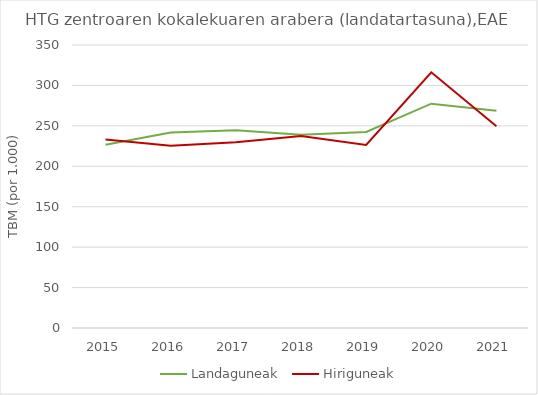
| Category | Landaguneak | Hiriguneak |
|---|---|---|
| 2015.0 | 226.665 | 233.213 |
| 2016.0 | 241.832 | 225.316 |
| 2017.0 | 244.688 | 229.614 |
| 2018.0 | 239.029 | 237.467 |
| 2019.0 | 242.361 | 226.394 |
| 2020.0 | 277.438 | 316.216 |
| 2021.0 | 268.604 | 249.426 |